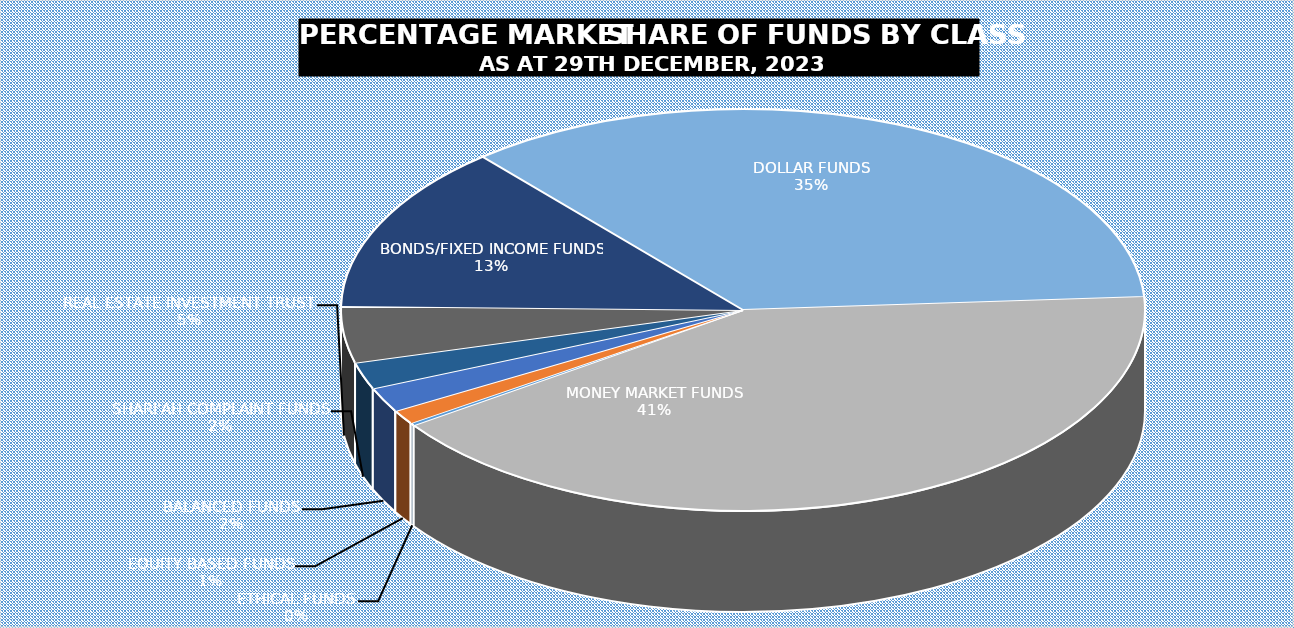
| Category | 29-Dec |
|---|---|
| ETHICAL FUNDS | 4392041950.51 |
| EQUITY BASED FUNDS | 24405214546.112 |
| BALANCED FUNDS | 42555783009.607 |
| SHARI'AH COMPLAINT FUNDS | 46069244637.508 |
| REAL ESTATE INVESTMENT TRUST | 96685745868.738 |
| BONDS/FIXED INCOME FUNDS | 287675389277.731 |
| DOLLAR FUNDS | 750658281364.382 |
| MONEY MARKET FUNDS | 881602898033.376 |